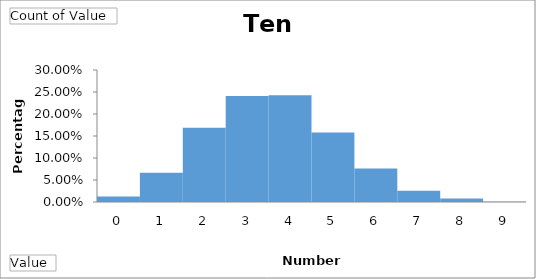
| Category | Total |
|---|---|
| 0 | 0.012 |
| 1 | 0.067 |
| 2 | 0.169 |
| 3 | 0.241 |
| 4 | 0.243 |
| 5 | 0.158 |
| 6 | 0.076 |
| 7 | 0.026 |
| 8 | 0.008 |
| 9 | 0.001 |